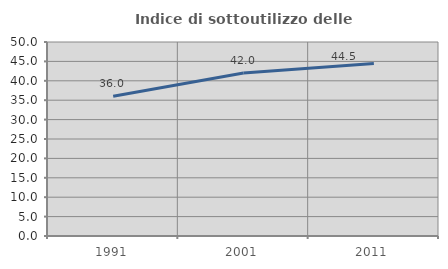
| Category | Indice di sottoutilizzo delle abitazioni  |
|---|---|
| 1991.0 | 36.018 |
| 2001.0 | 42.017 |
| 2011.0 | 44.489 |